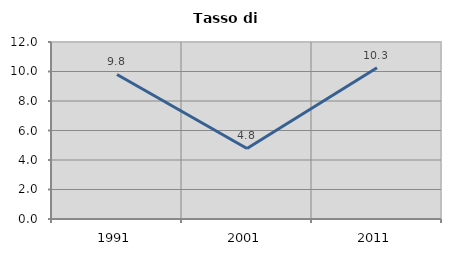
| Category | Tasso di disoccupazione   |
|---|---|
| 1991.0 | 9.8 |
| 2001.0 | 4.782 |
| 2011.0 | 10.251 |